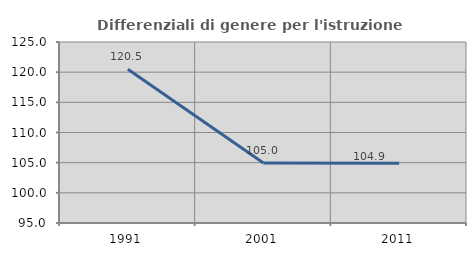
| Category | Differenziali di genere per l'istruzione superiore |
|---|---|
| 1991.0 | 120.492 |
| 2001.0 | 104.958 |
| 2011.0 | 104.889 |